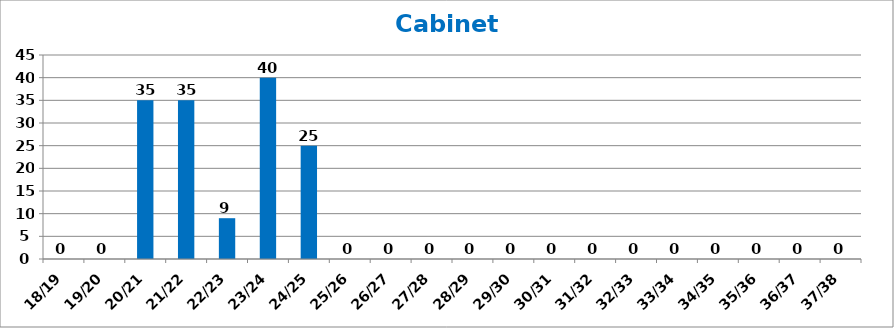
| Category | Cabinet Works |
|---|---|
| 18/19 | 0 |
| 19/20 | 0 |
| 20/21 | 35 |
| 21/22 | 35 |
| 22/23 | 9 |
| 23/24 | 40 |
| 24/25 | 25 |
| 25/26 | 0 |
| 26/27 | 0 |
| 27/28 | 0 |
| 28/29 | 0 |
| 29/30 | 0 |
| 30/31 | 0 |
| 31/32 | 0 |
| 32/33 | 0 |
| 33/34 | 0 |
| 34/35 | 0 |
| 35/36 | 0 |
| 36/37 | 0 |
| 37/38 | 0 |